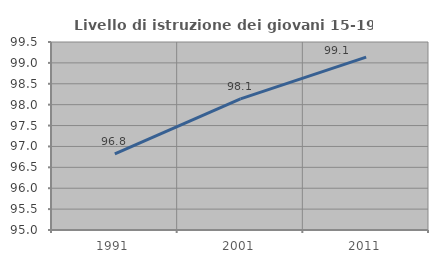
| Category | Livello di istruzione dei giovani 15-19 anni |
|---|---|
| 1991.0 | 96.82 |
| 2001.0 | 98.14 |
| 2011.0 | 99.138 |